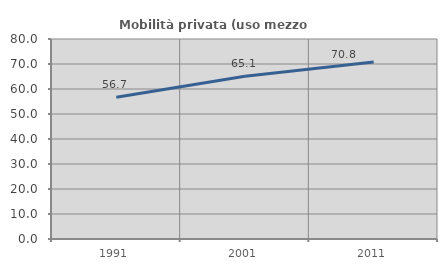
| Category | Mobilità privata (uso mezzo privato) |
|---|---|
| 1991.0 | 56.664 |
| 2001.0 | 65.126 |
| 2011.0 | 70.827 |